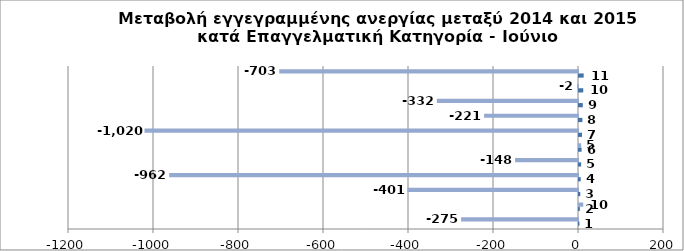
| Category | Series 0 | Series 1 |
|---|---|---|
| 0 | 1 | -275 |
| 1 | 2 | 10 |
| 2 | 3 | -401 |
| 3 | 4 | -962 |
| 4 | 5 | -148 |
| 5 | 6 | 5 |
| 6 | 7 | -1020 |
| 7 | 8 | -221 |
| 8 | 9 | -332 |
| 9 | 10 | -2 |
| 10 | 11 | -703 |